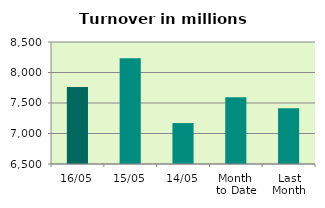
| Category | Series 0 |
|---|---|
| 16/05 | 7763.235 |
| 15/05 | 8233.56 |
| 14/05 | 7170.896 |
| Month 
to Date | 7595.421 |
| Last
Month | 7412.755 |